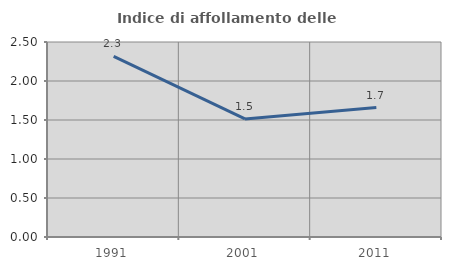
| Category | Indice di affollamento delle abitazioni  |
|---|---|
| 1991.0 | 2.316 |
| 2001.0 | 1.514 |
| 2011.0 | 1.66 |